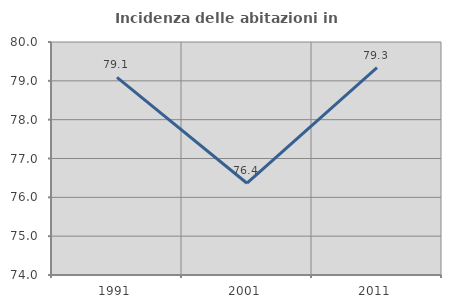
| Category | Incidenza delle abitazioni in proprietà  |
|---|---|
| 1991.0 | 79.09 |
| 2001.0 | 76.364 |
| 2011.0 | 79.339 |